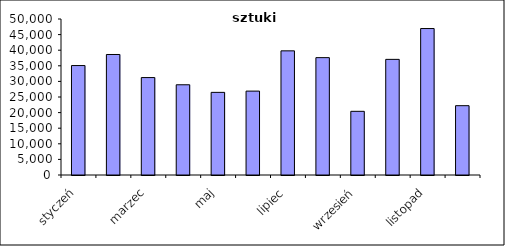
| Category | sztuki |
|---|---|
| styczeń | 35080.511 |
| luty | 38625.383 |
| marzec | 31228.479 |
| kwiecień | 28920.33 |
| maj | 26483.722 |
| czerwiec | 26890.835 |
| lipiec | 39791.415 |
| sierpień | 37616.881 |
| wrzesień | 20410.036 |
| październik | 37064.286 |
| listopad | 46942.077 |
| grudzień | 22217.164 |